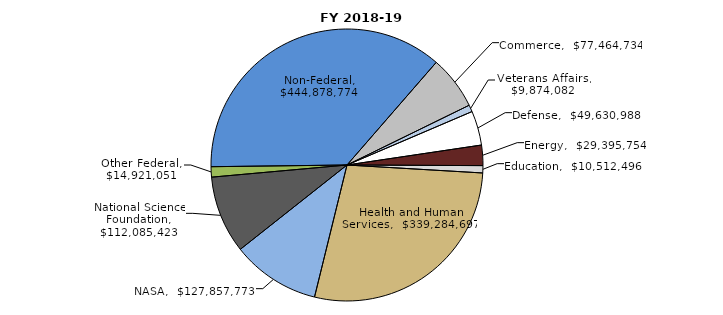
| Category | Series 0 |
|---|---|
| Commerce | 77464734 |
| Veterans Affairs | 9874082 |
| Defense | 49630988 |
| Energy | 29395754 |
| Education | 10512496 |
| Health and Human Services | 339284697 |
| NASA | 127857773 |
| National Science Foundation | 112085423 |
| Other Federal | 14921051 |
| Non-Federal | 444878774.47 |